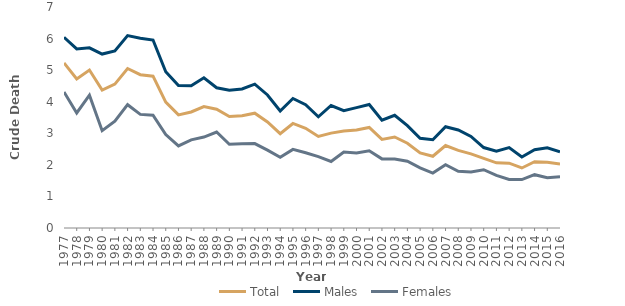
| Category | Total | Males | Females |
|---|---|---|---|
| 1977.0 | 5.23 | 6.04 | 4.311 |
| 1978.0 | 4.721 | 5.674 | 3.644 |
| 1979.0 | 5.002 | 5.708 | 4.207 |
| 1980.0 | 4.366 | 5.509 | 3.082 |
| 1981.0 | 4.556 | 5.609 | 3.386 |
| 1982.0 | 5.052 | 6.094 | 3.905 |
| 1983.0 | 4.855 | 6.01 | 3.599 |
| 1984.0 | 4.808 | 5.953 | 3.575 |
| 1985.0 | 3.987 | 4.951 | 2.96 |
| 1986.0 | 3.584 | 4.511 | 2.598 |
| 1987.0 | 3.674 | 4.506 | 2.793 |
| 1988.0 | 3.846 | 4.76 | 2.88 |
| 1989.0 | 3.76 | 4.442 | 3.041 |
| 1990.0 | 3.531 | 4.364 | 2.654 |
| 1991.0 | 3.557 | 4.405 | 2.668 |
| 1992.0 | 3.637 | 4.556 | 2.674 |
| 1993.0 | 3.358 | 4.214 | 2.465 |
| 1994.0 | 2.987 | 3.705 | 2.24 |
| 1995.0 | 3.311 | 4.102 | 2.49 |
| 1996.0 | 3.159 | 3.906 | 2.385 |
| 1997.0 | 2.901 | 3.523 | 2.259 |
| 1998.0 | 3.005 | 3.88 | 2.107 |
| 1999.0 | 3.071 | 3.719 | 2.409 |
| 2000.0 | 3.102 | 3.813 | 2.377 |
| 2001.0 | 3.184 | 3.913 | 2.446 |
| 2002.0 | 2.808 | 3.417 | 2.189 |
| 2003.0 | 2.883 | 3.57 | 2.184 |
| 2004.0 | 2.684 | 3.242 | 2.115 |
| 2005.0 | 2.378 | 2.841 | 1.906 |
| 2006.0 | 2.273 | 2.795 | 1.741 |
| 2007.0 | 2.612 | 3.209 | 2.004 |
| 2008.0 | 2.457 | 3.106 | 1.796 |
| 2009.0 | 2.347 | 2.9 | 1.776 |
| 2010.0 | 2.206 | 2.548 | 1.845 |
| 2011.0 | 2.063 | 2.436 | 1.668 |
| 2012.0 | 2.054 | 2.545 | 1.535 |
| 2013.0 | 1.901 | 2.248 | 1.533 |
| 2014.0 | 2.099 | 2.477 | 1.689 |
| 2015.0 | 2.081 | 2.54 | 1.595 |
| 2016.0 | 2.031 | 2.417 | 1.625 |